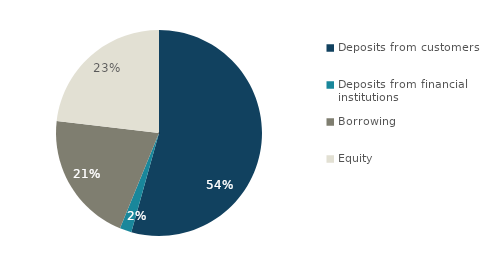
| Category | Series 0 |
|---|---|
| Deposits from customers | 589725 |
| Deposits from financial institutions | 20093 |
| Borrowing | 224332 |
| Equity | 251231 |